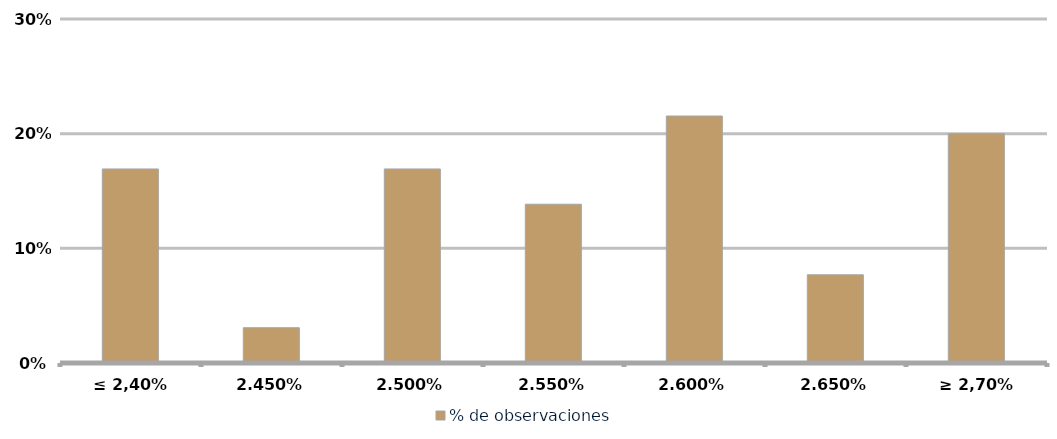
| Category | % de observaciones  |
|---|---|
| ≤ 2,40% | 0.169 |
| 2,45% | 0.031 |
| 2,50% | 0.169 |
| 2,55% | 0.138 |
| 2,60% | 0.215 |
| 2,65% | 0.077 |
| ≥ 2,70% | 0.2 |